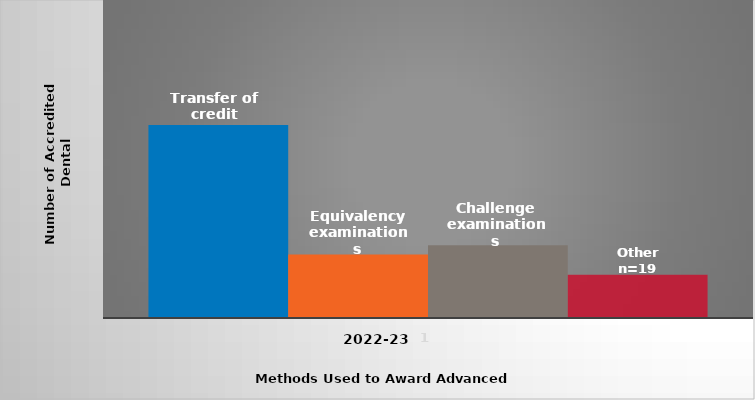
| Category | Transfer of credit | Equivalency examinations | Challenge examinations | Other |
|---|---|---|---|---|
| 0 | 85 | 28 | 32 | 19 |